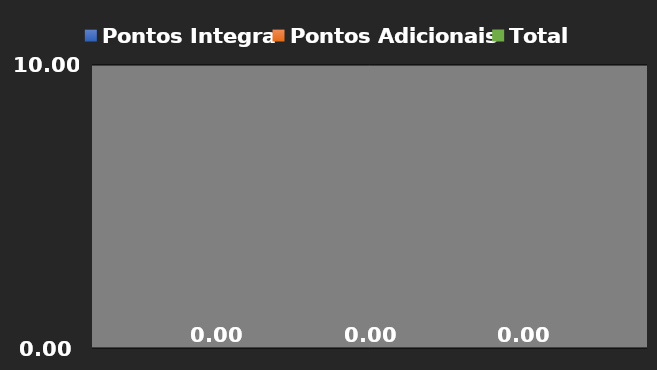
| Category | Pontos Integra | Pontos Adicionais | Total |
|---|---|---|---|
| 0 | 0 | 0 | 0 |